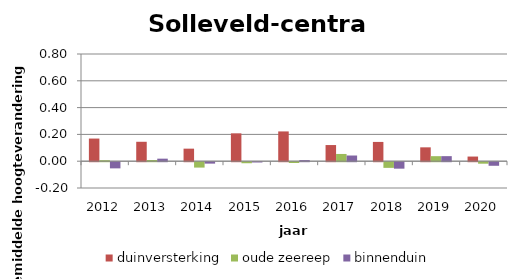
| Category | duinversterking | oude zeereep | binnenduin |
|---|---|---|---|
| 2012.0 | 0.169 | 0.008 | -0.046 |
| 2013.0 | 0.145 | 0.009 | 0.019 |
| 2014.0 | 0.094 | -0.04 | -0.011 |
| 2015.0 | 0.208 | -0.008 | -0.002 |
| 2016.0 | 0.222 | -0.006 | 0.008 |
| 2017.0 | 0.121 | 0.054 | 0.042 |
| 2018.0 | 0.144 | -0.042 | -0.048 |
| 2019.0 | 0.103 | 0.038 | 0.038 |
| 2020.0 | 0.035 | -0.011 | -0.027 |